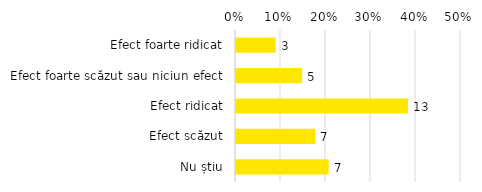
| Category | Total |
|---|---|
| Efect foarte ridicat | 0.088 |
| Efect foarte scăzut sau niciun efect | 0.147 |
| Efect ridicat | 0.382 |
| Efect scăzut | 0.176 |
| Nu știu | 0.206 |